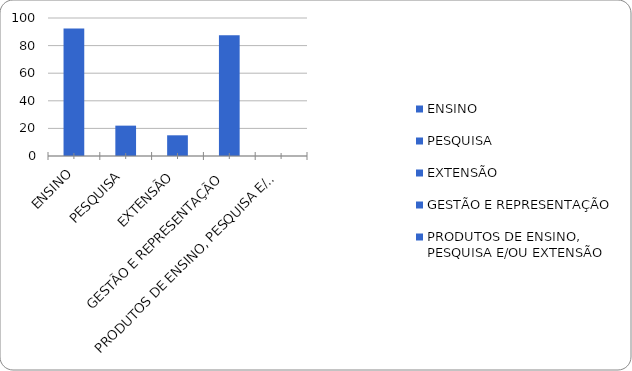
| Category | Series 0 |
|---|---|
| ENSINO | 92.333 |
| PESQUISA | 22 |
| EXTENSÃO | 15 |
| GESTÃO E REPRESENTAÇÃO | 87.5 |
| PRODUTOS DE ENSINO, PESQUISA E/OU EXTENSÃO | 0 |